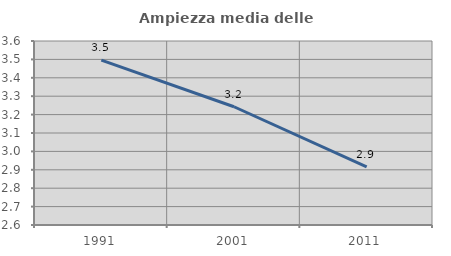
| Category | Ampiezza media delle famiglie |
|---|---|
| 1991.0 | 3.496 |
| 2001.0 | 3.243 |
| 2011.0 | 2.915 |